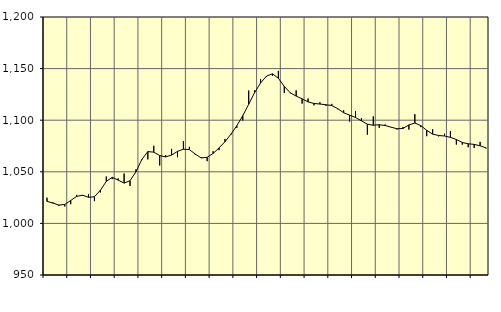
| Category | Piggar | Series 1 |
|---|---|---|
| nan | 1024.9 | 1021.36 |
| 1.0 | 1020.5 | 1019.7 |
| 1.0 | 1016.8 | 1017.78 |
| 1.0 | 1016.4 | 1018.34 |
| nan | 1018.6 | 1022.22 |
| 2.0 | 1027.6 | 1026.17 |
| 2.0 | 1026.6 | 1027.33 |
| 2.0 | 1028.5 | 1025.29 |
| nan | 1021.6 | 1025.85 |
| 3.0 | 1030 | 1032.08 |
| 3.0 | 1045.4 | 1040.68 |
| 3.0 | 1042.9 | 1044.65 |
| nan | 1043.6 | 1041.96 |
| 4.0 | 1048.3 | 1039.05 |
| 4.0 | 1036.3 | 1041.36 |
| 4.0 | 1052.4 | 1050.04 |
| nan | 1061.6 | 1062.05 |
| 5.0 | 1062 | 1069.59 |
| 5.0 | 1075.2 | 1069.02 |
| 5.0 | 1056.1 | 1065.77 |
| nan | 1066.2 | 1064.43 |
| 6.0 | 1072.2 | 1066.2 |
| 6.0 | 1064.2 | 1069.78 |
| 6.0 | 1079.7 | 1071.93 |
| nan | 1074.2 | 1071.51 |
| 7.0 | 1066.5 | 1067.18 |
| 7.0 | 1064.3 | 1063.44 |
| 7.0 | 1060.3 | 1064.03 |
| nan | 1069.9 | 1067.8 |
| 8.0 | 1071 | 1073.13 |
| 8.0 | 1081.8 | 1079.12 |
| 8.0 | 1085.7 | 1086.42 |
| nan | 1092.6 | 1094.68 |
| 9.0 | 1099.7 | 1104.4 |
| 9.0 | 1128.7 | 1115.47 |
| 9.0 | 1128.9 | 1126.77 |
| nan | 1139.7 | 1136.06 |
| 10.0 | 1142.2 | 1142.73 |
| 10.0 | 1143.1 | 1144.95 |
| 10.0 | 1147.8 | 1140.62 |
| nan | 1126.3 | 1132.73 |
| 11.0 | 1126.1 | 1126.56 |
| 11.0 | 1128.9 | 1123.36 |
| 11.0 | 1116.1 | 1120.68 |
| nan | 1121 | 1117.74 |
| 12.0 | 1114.4 | 1116.23 |
| 12.0 | 1117.3 | 1115.65 |
| 12.0 | 1113.9 | 1114.99 |
| nan | 1115.8 | 1114.24 |
| 13.0 | 1110.6 | 1111.18 |
| 13.0 | 1109.6 | 1107.23 |
| 13.0 | 1098.7 | 1104.91 |
| nan | 1108.6 | 1102.6 |
| 14.0 | 1102 | 1099.38 |
| 14.0 | 1086 | 1096.13 |
| 14.0 | 1103.7 | 1095.08 |
| nan | 1092.6 | 1095.63 |
| 15.0 | 1095.9 | 1094.84 |
| 15.0 | 1093.4 | 1093.24 |
| 15.0 | 1091 | 1091.69 |
| nan | 1093.4 | 1091.98 |
| 16.0 | 1090.9 | 1095.4 |
| 16.0 | 1105.8 | 1097.27 |
| 16.0 | 1093.3 | 1094.77 |
| nan | 1084.5 | 1090.19 |
| 17.0 | 1091.2 | 1086.47 |
| 17.0 | 1084.3 | 1085.2 |
| 17.0 | 1086.9 | 1084.66 |
| nan | 1089.4 | 1083.42 |
| 18.0 | 1076.4 | 1081.27 |
| 18.0 | 1076.3 | 1078.42 |
| 18.0 | 1073.8 | 1077.14 |
| nan | 1073.1 | 1076.56 |
| 19.0 | 1079 | 1075.19 |
| 19.0 | 1072.6 | 1073.21 |